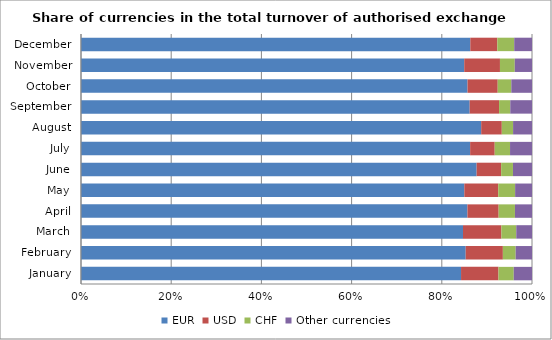
| Category | EUR | USD | CHF | Other currencies |
|---|---|---|---|---|
| January | 84.268 | 8.298 | 3.386 | 4.049 |
| February | 85.297 | 8.245 | 2.837 | 3.621 |
| March | 84.7 | 8.514 | 3.296 | 3.49 |
| April | 85.684 | 6.922 | 3.617 | 3.777 |
| May | 84.991 | 7.524 | 3.742 | 3.742 |
| June | 87.721 | 5.439 | 2.619 | 4.221 |
| July | 86.284 | 5.449 | 3.399 | 4.868 |
| August | 88.733 | 4.571 | 2.502 | 4.194 |
| September | 86.182 | 6.515 | 2.483 | 4.819 |
| October | 85.706 | 6.694 | 3.012 | 4.588 |
| November | 84.972 | 7.923 | 3.285 | 3.821 |
| December | 86.316 | 5.999 | 3.743 | 3.942 |